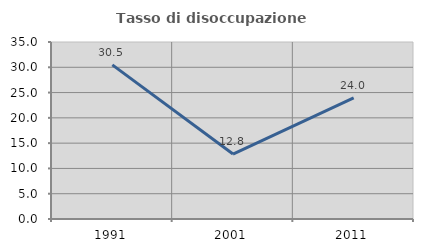
| Category | Tasso di disoccupazione giovanile  |
|---|---|
| 1991.0 | 30.481 |
| 2001.0 | 12.844 |
| 2011.0 | 23.958 |